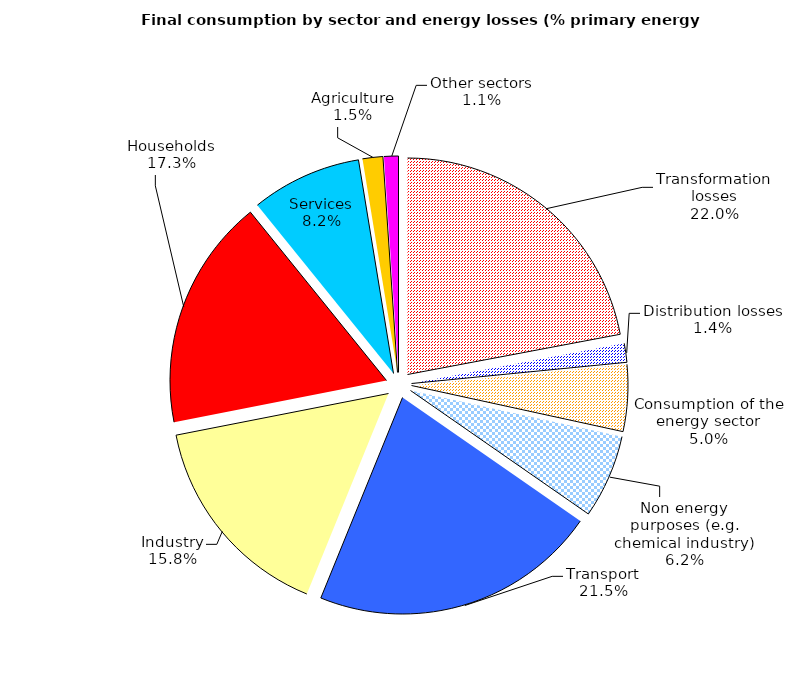
| Category | Series 0 |
|---|---|
| Transformation losses | 376627 |
| Distribution losses | 24156 |
| Consumption of the energy sector | 85159 |
| Non energy purposes (e.g. chemical industry) | 106712 |
| Transport | 367636 |
| Industry | 269455 |
| Households | 295206 |
| Services | 140760 |
| Agriculture | 25893 |
| Other sectors | 18355 |